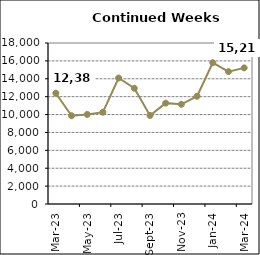
| Category | Series 0 |
|---|---|
| 2023-03-01 | 12383 |
| 2023-04-01 | 9869 |
| 2023-05-01 | 10014 |
| 2023-06-01 | 10266 |
| 2023-07-01 | 14088 |
| 2023-08-01 | 12937 |
| 2023-09-01 | 9899 |
| 2023-10-01 | 11277 |
| 2023-11-01 | 11150 |
| 2023-12-01 | 12049 |
| 2024-01-01 | 15796 |
| 2024-02-01 | 14798 |
| 2024-03-01 | 15218 |